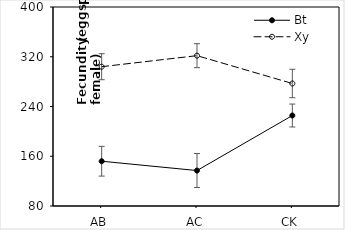
| Category | Bt | Xy |
|---|---|---|
| AB | 152 | 304 |
| AC | 137 | 321.75 |
| CK | 225.5 | 277 |